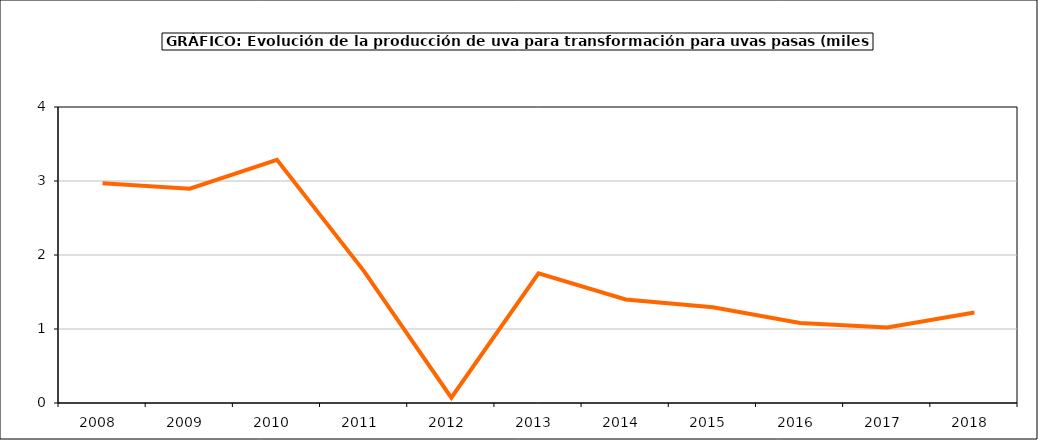
| Category | producción |
|---|---|
| 2008.0 | 2.971 |
| 2009.0 | 2.897 |
| 2010.0 | 3.286 |
| 2011.0 | 1.779 |
| 2012.0 | 0.072 |
| 2013.0 | 1.751 |
| 2014.0 | 1.399 |
| 2015.0 | 1.295 |
| 2016.0 | 1.082 |
| 2017.0 | 1.02 |
| 2018.0 | 1.223 |